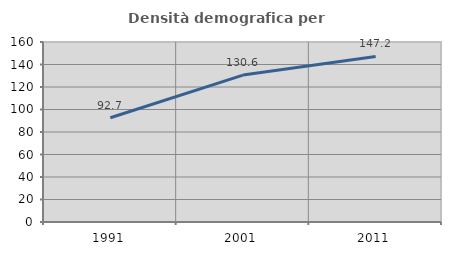
| Category | Densità demografica |
|---|---|
| 1991.0 | 92.656 |
| 2001.0 | 130.581 |
| 2011.0 | 147.173 |